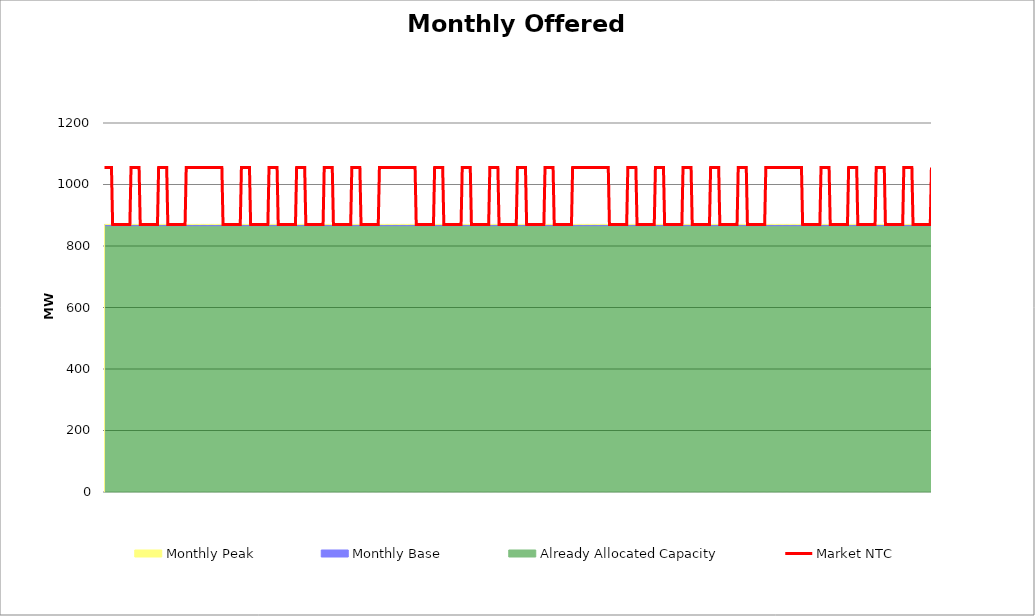
| Category | Market NTC |
|---|---|
| 0 | 1055 |
| 1 | 1055 |
| 2 | 1055 |
| 3 | 1055 |
| 4 | 1055 |
| 5 | 1055 |
| 6 | 1055 |
| 7 | 870 |
| 8 | 870 |
| 9 | 870 |
| 10 | 870 |
| 11 | 870 |
| 12 | 870 |
| 13 | 870 |
| 14 | 870 |
| 15 | 870 |
| 16 | 870 |
| 17 | 870 |
| 18 | 870 |
| 19 | 870 |
| 20 | 870 |
| 21 | 870 |
| 22 | 870 |
| 23 | 1055 |
| 24 | 1055 |
| 25 | 1055 |
| 26 | 1055 |
| 27 | 1055 |
| 28 | 1055 |
| 29 | 1055 |
| 30 | 1055 |
| 31 | 870 |
| 32 | 870 |
| 33 | 870 |
| 34 | 870 |
| 35 | 870 |
| 36 | 870 |
| 37 | 870 |
| 38 | 870 |
| 39 | 870 |
| 40 | 870 |
| 41 | 870 |
| 42 | 870 |
| 43 | 870 |
| 44 | 870 |
| 45 | 870 |
| 46 | 870 |
| 47 | 1055 |
| 48 | 1055 |
| 49 | 1055 |
| 50 | 1055 |
| 51 | 1055 |
| 52 | 1055 |
| 53 | 1055 |
| 54 | 1055 |
| 55 | 870 |
| 56 | 870 |
| 57 | 870 |
| 58 | 870 |
| 59 | 870 |
| 60 | 870 |
| 61 | 870 |
| 62 | 870 |
| 63 | 870 |
| 64 | 870 |
| 65 | 870 |
| 66 | 870 |
| 67 | 870 |
| 68 | 870 |
| 69 | 870 |
| 70 | 870 |
| 71 | 1055 |
| 72 | 1055 |
| 73 | 1055 |
| 74 | 1055 |
| 75 | 1055 |
| 76 | 1055 |
| 77 | 1055 |
| 78 | 1055 |
| 79 | 1055 |
| 80 | 1055 |
| 81 | 1055 |
| 82 | 1055 |
| 83 | 1055 |
| 84 | 1055 |
| 85 | 1055 |
| 86 | 1055 |
| 87 | 1055 |
| 88 | 1055 |
| 89 | 1055 |
| 90 | 1055 |
| 91 | 1055 |
| 92 | 1055 |
| 93 | 1055 |
| 94 | 1055 |
| 95 | 1055 |
| 96 | 1055 |
| 97 | 1055 |
| 98 | 1055 |
| 99 | 1055 |
| 100 | 1055 |
| 101 | 1055 |
| 102 | 1055 |
| 103 | 870 |
| 104 | 870 |
| 105 | 870 |
| 106 | 870 |
| 107 | 870 |
| 108 | 870 |
| 109 | 870 |
| 110 | 870 |
| 111 | 870 |
| 112 | 870 |
| 113 | 870 |
| 114 | 870 |
| 115 | 870 |
| 116 | 870 |
| 117 | 870 |
| 118 | 870 |
| 119 | 1055 |
| 120 | 1055 |
| 121 | 1055 |
| 122 | 1055 |
| 123 | 1055 |
| 124 | 1055 |
| 125 | 1055 |
| 126 | 1055 |
| 127 | 870 |
| 128 | 870 |
| 129 | 870 |
| 130 | 870 |
| 131 | 870 |
| 132 | 870 |
| 133 | 870 |
| 134 | 870 |
| 135 | 870 |
| 136 | 870 |
| 137 | 870 |
| 138 | 870 |
| 139 | 870 |
| 140 | 870 |
| 141 | 870 |
| 142 | 870 |
| 143 | 1055 |
| 144 | 1055 |
| 145 | 1055 |
| 146 | 1055 |
| 147 | 1055 |
| 148 | 1055 |
| 149 | 1055 |
| 150 | 1055 |
| 151 | 870 |
| 152 | 870 |
| 153 | 870 |
| 154 | 870 |
| 155 | 870 |
| 156 | 870 |
| 157 | 870 |
| 158 | 870 |
| 159 | 870 |
| 160 | 870 |
| 161 | 870 |
| 162 | 870 |
| 163 | 870 |
| 164 | 870 |
| 165 | 870 |
| 166 | 870 |
| 167 | 1055 |
| 168 | 1055 |
| 169 | 1055 |
| 170 | 1055 |
| 171 | 1055 |
| 172 | 1055 |
| 173 | 1055 |
| 174 | 1055 |
| 175 | 870 |
| 176 | 870 |
| 177 | 870 |
| 178 | 870 |
| 179 | 870 |
| 180 | 870 |
| 181 | 870 |
| 182 | 870 |
| 183 | 870 |
| 184 | 870 |
| 185 | 870 |
| 186 | 870 |
| 187 | 870 |
| 188 | 870 |
| 189 | 870 |
| 190 | 870 |
| 191 | 1055 |
| 192 | 1055 |
| 193 | 1055 |
| 194 | 1055 |
| 195 | 1055 |
| 196 | 1055 |
| 197 | 1055 |
| 198 | 1055 |
| 199 | 870 |
| 200 | 870 |
| 201 | 870 |
| 202 | 870 |
| 203 | 870 |
| 204 | 870 |
| 205 | 870 |
| 206 | 870 |
| 207 | 870 |
| 208 | 870 |
| 209 | 870 |
| 210 | 870 |
| 211 | 870 |
| 212 | 870 |
| 213 | 870 |
| 214 | 870 |
| 215 | 1055 |
| 216 | 1055 |
| 217 | 1055 |
| 218 | 1055 |
| 219 | 1055 |
| 220 | 1055 |
| 221 | 1055 |
| 222 | 1055 |
| 223 | 870 |
| 224 | 870 |
| 225 | 870 |
| 226 | 870 |
| 227 | 870 |
| 228 | 870 |
| 229 | 870 |
| 230 | 870 |
| 231 | 870 |
| 232 | 870 |
| 233 | 870 |
| 234 | 870 |
| 235 | 870 |
| 236 | 870 |
| 237 | 870 |
| 238 | 870 |
| 239 | 1055 |
| 240 | 1055 |
| 241 | 1055 |
| 242 | 1055 |
| 243 | 1055 |
| 244 | 1055 |
| 245 | 1055 |
| 246 | 1055 |
| 247 | 1055 |
| 248 | 1055 |
| 249 | 1055 |
| 250 | 1055 |
| 251 | 1055 |
| 252 | 1055 |
| 253 | 1055 |
| 254 | 1055 |
| 255 | 1055 |
| 256 | 1055 |
| 257 | 1055 |
| 258 | 1055 |
| 259 | 1055 |
| 260 | 1055 |
| 261 | 1055 |
| 262 | 1055 |
| 263 | 1055 |
| 264 | 1055 |
| 265 | 1055 |
| 266 | 1055 |
| 267 | 1055 |
| 268 | 1055 |
| 269 | 1055 |
| 270 | 1055 |
| 271 | 870 |
| 272 | 870 |
| 273 | 870 |
| 274 | 870 |
| 275 | 870 |
| 276 | 870 |
| 277 | 870 |
| 278 | 870 |
| 279 | 870 |
| 280 | 870 |
| 281 | 870 |
| 282 | 870 |
| 283 | 870 |
| 284 | 870 |
| 285 | 870 |
| 286 | 870 |
| 287 | 1055 |
| 288 | 1055 |
| 289 | 1055 |
| 290 | 1055 |
| 291 | 1055 |
| 292 | 1055 |
| 293 | 1055 |
| 294 | 1055 |
| 295 | 870 |
| 296 | 870 |
| 297 | 870 |
| 298 | 870 |
| 299 | 870 |
| 300 | 870 |
| 301 | 870 |
| 302 | 870 |
| 303 | 870 |
| 304 | 870 |
| 305 | 870 |
| 306 | 870 |
| 307 | 870 |
| 308 | 870 |
| 309 | 870 |
| 310 | 870 |
| 311 | 1055 |
| 312 | 1055 |
| 313 | 1055 |
| 314 | 1055 |
| 315 | 1055 |
| 316 | 1055 |
| 317 | 1055 |
| 318 | 1055 |
| 319 | 870 |
| 320 | 870 |
| 321 | 870 |
| 322 | 870 |
| 323 | 870 |
| 324 | 870 |
| 325 | 870 |
| 326 | 870 |
| 327 | 870 |
| 328 | 870 |
| 329 | 870 |
| 330 | 870 |
| 331 | 870 |
| 332 | 870 |
| 333 | 870 |
| 334 | 870 |
| 335 | 1055 |
| 336 | 1055 |
| 337 | 1055 |
| 338 | 1055 |
| 339 | 1055 |
| 340 | 1055 |
| 341 | 1055 |
| 342 | 1055 |
| 343 | 870 |
| 344 | 870 |
| 345 | 870 |
| 346 | 870 |
| 347 | 870 |
| 348 | 870 |
| 349 | 870 |
| 350 | 870 |
| 351 | 870 |
| 352 | 870 |
| 353 | 870 |
| 354 | 870 |
| 355 | 870 |
| 356 | 870 |
| 357 | 870 |
| 358 | 870 |
| 359 | 1055 |
| 360 | 1055 |
| 361 | 1055 |
| 362 | 1055 |
| 363 | 1055 |
| 364 | 1055 |
| 365 | 1055 |
| 366 | 1055 |
| 367 | 870 |
| 368 | 870 |
| 369 | 870 |
| 370 | 870 |
| 371 | 870 |
| 372 | 870 |
| 373 | 870 |
| 374 | 870 |
| 375 | 870 |
| 376 | 870 |
| 377 | 870 |
| 378 | 870 |
| 379 | 870 |
| 380 | 870 |
| 381 | 870 |
| 382 | 870 |
| 383 | 1055 |
| 384 | 1055 |
| 385 | 1055 |
| 386 | 1055 |
| 387 | 1055 |
| 388 | 1055 |
| 389 | 1055 |
| 390 | 1055 |
| 391 | 870 |
| 392 | 870 |
| 393 | 870 |
| 394 | 870 |
| 395 | 870 |
| 396 | 870 |
| 397 | 870 |
| 398 | 870 |
| 399 | 870 |
| 400 | 870 |
| 401 | 870 |
| 402 | 870 |
| 403 | 870 |
| 404 | 870 |
| 405 | 870 |
| 406 | 870 |
| 407 | 1055 |
| 408 | 1055 |
| 409 | 1055 |
| 410 | 1055 |
| 411 | 1055 |
| 412 | 1055 |
| 413 | 1055 |
| 414 | 1055 |
| 415 | 1055 |
| 416 | 1055 |
| 417 | 1055 |
| 418 | 1055 |
| 419 | 1055 |
| 420 | 1055 |
| 421 | 1055 |
| 422 | 1055 |
| 423 | 1055 |
| 424 | 1055 |
| 425 | 1055 |
| 426 | 1055 |
| 427 | 1055 |
| 428 | 1055 |
| 429 | 1055 |
| 430 | 1055 |
| 431 | 1055 |
| 432 | 1055 |
| 433 | 1055 |
| 434 | 1055 |
| 435 | 1055 |
| 436 | 1055 |
| 437 | 1055 |
| 438 | 1055 |
| 439 | 870 |
| 440 | 870 |
| 441 | 870 |
| 442 | 870 |
| 443 | 870 |
| 444 | 870 |
| 445 | 870 |
| 446 | 870 |
| 447 | 870 |
| 448 | 870 |
| 449 | 870 |
| 450 | 870 |
| 451 | 870 |
| 452 | 870 |
| 453 | 870 |
| 454 | 870 |
| 455 | 1055 |
| 456 | 1055 |
| 457 | 1055 |
| 458 | 1055 |
| 459 | 1055 |
| 460 | 1055 |
| 461 | 1055 |
| 462 | 1055 |
| 463 | 870 |
| 464 | 870 |
| 465 | 870 |
| 466 | 870 |
| 467 | 870 |
| 468 | 870 |
| 469 | 870 |
| 470 | 870 |
| 471 | 870 |
| 472 | 870 |
| 473 | 870 |
| 474 | 870 |
| 475 | 870 |
| 476 | 870 |
| 477 | 870 |
| 478 | 870 |
| 479 | 1055 |
| 480 | 1055 |
| 481 | 1055 |
| 482 | 1055 |
| 483 | 1055 |
| 484 | 1055 |
| 485 | 1055 |
| 486 | 1055 |
| 487 | 870 |
| 488 | 870 |
| 489 | 870 |
| 490 | 870 |
| 491 | 870 |
| 492 | 870 |
| 493 | 870 |
| 494 | 870 |
| 495 | 870 |
| 496 | 870 |
| 497 | 870 |
| 498 | 870 |
| 499 | 870 |
| 500 | 870 |
| 501 | 870 |
| 502 | 870 |
| 503 | 1055 |
| 504 | 1055 |
| 505 | 1055 |
| 506 | 1055 |
| 507 | 1055 |
| 508 | 1055 |
| 509 | 1055 |
| 510 | 1055 |
| 511 | 870 |
| 512 | 870 |
| 513 | 870 |
| 514 | 870 |
| 515 | 870 |
| 516 | 870 |
| 517 | 870 |
| 518 | 870 |
| 519 | 870 |
| 520 | 870 |
| 521 | 870 |
| 522 | 870 |
| 523 | 870 |
| 524 | 870 |
| 525 | 870 |
| 526 | 870 |
| 527 | 1055 |
| 528 | 1055 |
| 529 | 1055 |
| 530 | 1055 |
| 531 | 1055 |
| 532 | 1055 |
| 533 | 1055 |
| 534 | 1055 |
| 535 | 870 |
| 536 | 870 |
| 537 | 870 |
| 538 | 870 |
| 539 | 870 |
| 540 | 870 |
| 541 | 870 |
| 542 | 870 |
| 543 | 870 |
| 544 | 870 |
| 545 | 870 |
| 546 | 870 |
| 547 | 870 |
| 548 | 870 |
| 549 | 870 |
| 550 | 870 |
| 551 | 1055 |
| 552 | 1055 |
| 553 | 1055 |
| 554 | 1055 |
| 555 | 1055 |
| 556 | 1055 |
| 557 | 1055 |
| 558 | 1055 |
| 559 | 870 |
| 560 | 870 |
| 561 | 870 |
| 562 | 870 |
| 563 | 870 |
| 564 | 870 |
| 565 | 870 |
| 566 | 870 |
| 567 | 870 |
| 568 | 870 |
| 569 | 870 |
| 570 | 870 |
| 571 | 870 |
| 572 | 870 |
| 573 | 870 |
| 574 | 870 |
| 575 | 1055 |
| 576 | 1055 |
| 577 | 1055 |
| 578 | 1055 |
| 579 | 1055 |
| 580 | 1055 |
| 581 | 1055 |
| 582 | 1055 |
| 583 | 1055 |
| 584 | 1055 |
| 585 | 1055 |
| 586 | 1055 |
| 587 | 1055 |
| 588 | 1055 |
| 589 | 1055 |
| 590 | 1055 |
| 591 | 1055 |
| 592 | 1055 |
| 593 | 1055 |
| 594 | 1055 |
| 595 | 1055 |
| 596 | 1055 |
| 597 | 1055 |
| 598 | 1055 |
| 599 | 1055 |
| 600 | 1055 |
| 601 | 1055 |
| 602 | 1055 |
| 603 | 1055 |
| 604 | 1055 |
| 605 | 1055 |
| 606 | 1055 |
| 607 | 870 |
| 608 | 870 |
| 609 | 870 |
| 610 | 870 |
| 611 | 870 |
| 612 | 870 |
| 613 | 870 |
| 614 | 870 |
| 615 | 870 |
| 616 | 870 |
| 617 | 870 |
| 618 | 870 |
| 619 | 870 |
| 620 | 870 |
| 621 | 870 |
| 622 | 870 |
| 623 | 1055 |
| 624 | 1055 |
| 625 | 1055 |
| 626 | 1055 |
| 627 | 1055 |
| 628 | 1055 |
| 629 | 1055 |
| 630 | 1055 |
| 631 | 870 |
| 632 | 870 |
| 633 | 870 |
| 634 | 870 |
| 635 | 870 |
| 636 | 870 |
| 637 | 870 |
| 638 | 870 |
| 639 | 870 |
| 640 | 870 |
| 641 | 870 |
| 642 | 870 |
| 643 | 870 |
| 644 | 870 |
| 645 | 870 |
| 646 | 870 |
| 647 | 1055 |
| 648 | 1055 |
| 649 | 1055 |
| 650 | 1055 |
| 651 | 1055 |
| 652 | 1055 |
| 653 | 1055 |
| 654 | 1055 |
| 655 | 870 |
| 656 | 870 |
| 657 | 870 |
| 658 | 870 |
| 659 | 870 |
| 660 | 870 |
| 661 | 870 |
| 662 | 870 |
| 663 | 870 |
| 664 | 870 |
| 665 | 870 |
| 666 | 870 |
| 667 | 870 |
| 668 | 870 |
| 669 | 870 |
| 670 | 870 |
| 671 | 1055 |
| 672 | 1055 |
| 673 | 1055 |
| 674 | 1055 |
| 675 | 1055 |
| 676 | 1055 |
| 677 | 1055 |
| 678 | 1055 |
| 679 | 870 |
| 680 | 870 |
| 681 | 870 |
| 682 | 870 |
| 683 | 870 |
| 684 | 870 |
| 685 | 870 |
| 686 | 870 |
| 687 | 870 |
| 688 | 870 |
| 689 | 870 |
| 690 | 870 |
| 691 | 870 |
| 692 | 870 |
| 693 | 870 |
| 694 | 870 |
| 695 | 1055 |
| 696 | 1055 |
| 697 | 1055 |
| 698 | 1055 |
| 699 | 1055 |
| 700 | 1055 |
| 701 | 1055 |
| 702 | 1055 |
| 703 | 870 |
| 704 | 870 |
| 705 | 870 |
| 706 | 870 |
| 707 | 870 |
| 708 | 870 |
| 709 | 870 |
| 710 | 870 |
| 711 | 870 |
| 712 | 870 |
| 713 | 870 |
| 714 | 870 |
| 715 | 870 |
| 716 | 870 |
| 717 | 870 |
| 718 | 870 |
| 719 | 1055 |